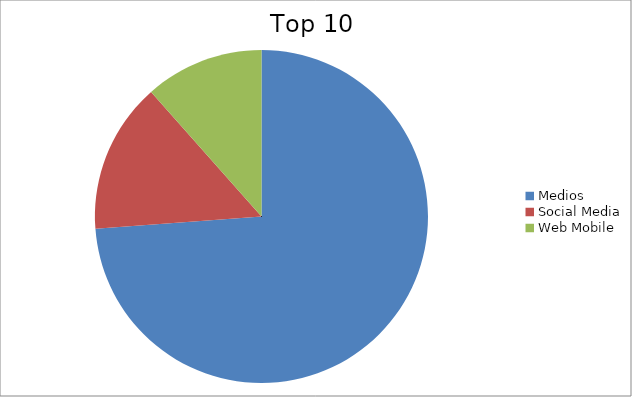
| Category | Series 0 |
|---|---|
| Medios | 73.83 |
| Social Media | 14.63 |
| Web Mobile | 11.54 |